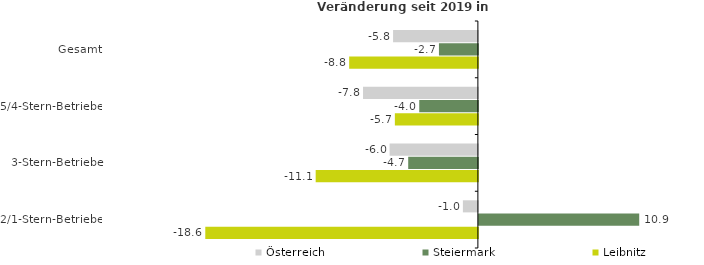
| Category | Österreich | Steiermark | Leibnitz |
|---|---|---|---|
| Gesamt | -5.779 | -2.653 | -8.77 |
| 5/4-Stern-Betriebe | -7.825 | -3.996 | -5.656 |
| 3-Stern-Betriebe | -6.014 | -4.748 | -11.053 |
| 2/1-Stern-Betriebe | -1.021 | 10.926 | -18.575 |